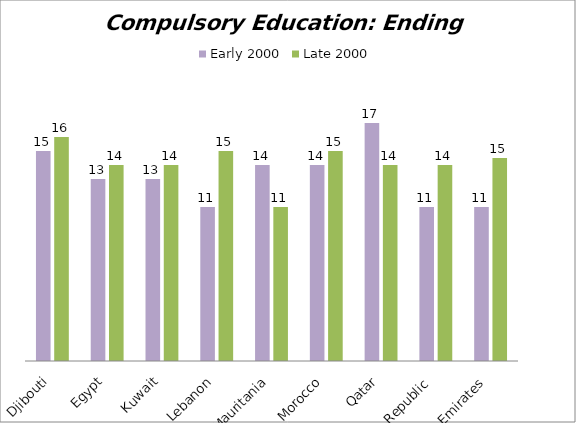
| Category | Early 2000 | Late 2000 |
|---|---|---|
| Djibouti | 15 | 16 |
| Egypt | 13 | 14 |
| Kuwait | 13 | 14 |
| Lebanon | 11 | 15 |
| Mauritania | 14 | 11 |
| Morocco | 14 | 15 |
| Qatar | 17 | 14 |
| Syrian Arab Republic | 11 | 14 |
| United Arab Emirates | 11 | 14.5 |